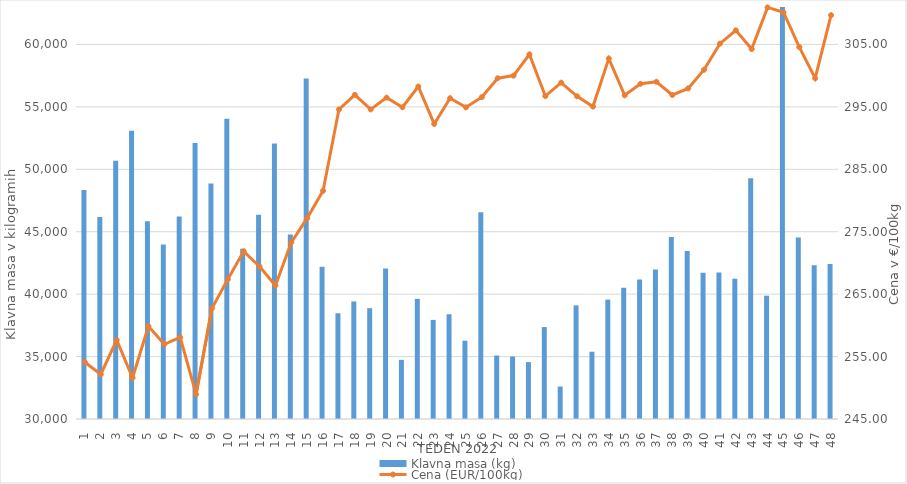
| Category | Klavna masa (kg) |
|---|---|
| 1.0 | 48349 |
| 2.0 | 46187 |
| 3.0 | 50692 |
| 4.0 | 53081 |
| 5.0 | 45844 |
| 6.0 | 43982 |
| 7.0 | 46227 |
| 8.0 | 52099 |
| 9.0 | 48872 |
| 10.0 | 54045 |
| 11.0 | 43645 |
| 12.0 | 46350 |
| 13.0 | 52061 |
| 14.0 | 44774 |
| 15.0 | 57268 |
| 16.0 | 42191 |
| 17.0 | 38469 |
| 18.0 | 39417 |
| 19.0 | 38876 |
| 20.0 | 42047 |
| 21.0 | 34739 |
| 22.0 | 39626 |
| 23.0 | 37939 |
| 24.0 | 38390 |
| 25.0 | 36272 |
| 26.0 | 46553 |
| 27.0 | 35085 |
| 28.0 | 35007 |
| 29.0 | 34559 |
| 30.0 | 37366 |
| 31.0 | 32599 |
| 32.0 | 39100 |
| 33.0 | 35388 |
| 34.0 | 39563 |
| 35.0 | 40507 |
| 36.0 | 41176 |
| 37.0 | 41983 |
| 38.0 | 44572 |
| 39.0 | 43447 |
| 40.0 | 41711 |
| 41.0 | 41736 |
| 42.0 | 41239 |
| 43.0 | 49284 |
| 44.0 | 39877 |
| 45.0 | 63668 |
| 46.0 | 44528 |
| 47.0 | 42319 |
| 48.0 | 42416 |